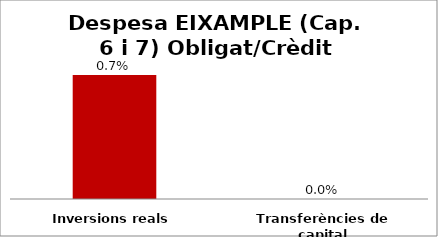
| Category | Series 0 |
|---|---|
| Inversions reals | 0.007 |
| Transferències de capital | 0 |